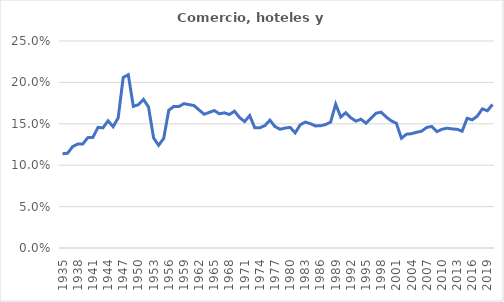
| Category | Comercio, hoteles y restaurantes |
|---|---|
| 1935.0 | 0.114 |
| 1936.0 | 0.114 |
| 1937.0 | 0.122 |
| 1938.0 | 0.126 |
| 1939.0 | 0.126 |
| 1940.0 | 0.133 |
| 1941.0 | 0.133 |
| 1942.0 | 0.146 |
| 1943.0 | 0.145 |
| 1944.0 | 0.154 |
| 1945.0 | 0.146 |
| 1946.0 | 0.157 |
| 1947.0 | 0.206 |
| 1948.0 | 0.209 |
| 1949.0 | 0.171 |
| 1950.0 | 0.173 |
| 1951.0 | 0.179 |
| 1952.0 | 0.17 |
| 1953.0 | 0.133 |
| 1954.0 | 0.124 |
| 1955.0 | 0.132 |
| 1956.0 | 0.166 |
| 1957.0 | 0.171 |
| 1958.0 | 0.171 |
| 1959.0 | 0.174 |
| 1960.0 | 0.173 |
| 1961.0 | 0.172 |
| 1962.0 | 0.167 |
| 1963.0 | 0.162 |
| 1964.0 | 0.164 |
| 1965.0 | 0.166 |
| 1966.0 | 0.162 |
| 1967.0 | 0.163 |
| 1968.0 | 0.161 |
| 1969.0 | 0.165 |
| 1970.0 | 0.158 |
| 1971.0 | 0.153 |
| 1972.0 | 0.16 |
| 1973.0 | 0.145 |
| 1974.0 | 0.145 |
| 1975.0 | 0.148 |
| 1976.0 | 0.154 |
| 1977.0 | 0.147 |
| 1978.0 | 0.143 |
| 1979.0 | 0.145 |
| 1980.0 | 0.146 |
| 1981.0 | 0.139 |
| 1982.0 | 0.149 |
| 1983.0 | 0.152 |
| 1984.0 | 0.15 |
| 1985.0 | 0.147 |
| 1986.0 | 0.148 |
| 1987.0 | 0.149 |
| 1988.0 | 0.152 |
| 1989.0 | 0.174 |
| 1990.0 | 0.158 |
| 1991.0 | 0.163 |
| 1992.0 | 0.157 |
| 1993.0 | 0.153 |
| 1994.0 | 0.156 |
| 1995.0 | 0.151 |
| 1996.0 | 0.157 |
| 1997.0 | 0.163 |
| 1998.0 | 0.164 |
| 1999.0 | 0.158 |
| 2000.0 | 0.154 |
| 2001.0 | 0.151 |
| 2002.0 | 0.133 |
| 2003.0 | 0.137 |
| 2004.0 | 0.138 |
| 2005.0 | 0.14 |
| 2006.0 | 0.141 |
| 2007.0 | 0.146 |
| 2008.0 | 0.147 |
| 2009.0 | 0.14 |
| 2010.0 | 0.143 |
| 2011.0 | 0.145 |
| 2012.0 | 0.144 |
| 2013.0 | 0.143 |
| 2014.0 | 0.141 |
| 2015.0 | 0.157 |
| 2016.0 | 0.155 |
| 2017.0 | 0.159 |
| 2018.0 | 0.168 |
| 2019.0 | 0.166 |
| 2020.0 | 0.173 |